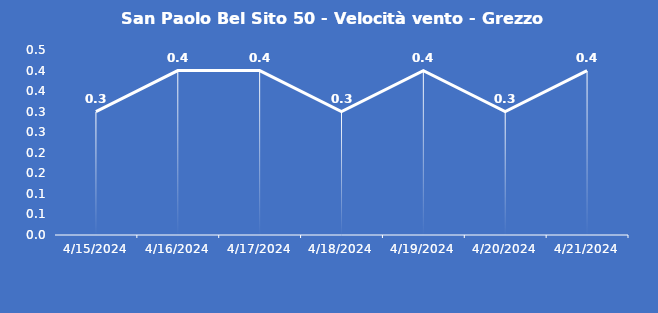
| Category | San Paolo Bel Sito 50 - Velocità vento - Grezzo (m/s) |
|---|---|
| 4/15/24 | 0.3 |
| 4/16/24 | 0.4 |
| 4/17/24 | 0.4 |
| 4/18/24 | 0.3 |
| 4/19/24 | 0.4 |
| 4/20/24 | 0.3 |
| 4/21/24 | 0.4 |